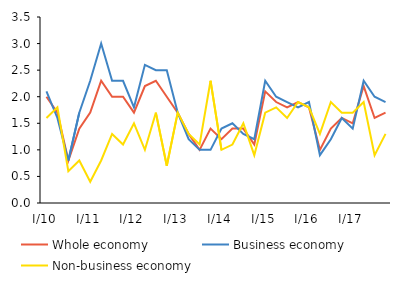
| Category | Whole economy | Business economy | Non-business economy |
|---|---|---|---|
| I/10 | 2 | 2.1 | 1.6 |
| II | 1.7 | 1.6 | 1.8 |
| III | 0.8 | 0.8 | 0.6 |
| IV | 1.4 | 1.7 | 0.8 |
| I/11 | 1.7 | 2.3 | 0.4 |
| II | 2.3 | 3 | 0.8 |
| III | 2 | 2.3 | 1.3 |
| IV | 2 | 2.3 | 1.1 |
| I/12 | 1.7 | 1.8 | 1.5 |
| II | 2.2 | 2.6 | 1 |
| III | 2.3 | 2.5 | 1.7 |
| IV | 2 | 2.5 | 0.7 |
| I/13 | 1.7 | 1.7 | 1.7 |
| II | 1.3 | 1.2 | 1.3 |
| III | 1 | 1 | 1.1 |
| IV | 1.4 | 1 | 2.3 |
| I/14 | 1.2 | 1.4 | 1 |
| II | 1.4 | 1.5 | 1.1 |
| III | 1.4 | 1.3 | 1.5 |
| IV | 1.1 | 1.2 | 0.9 |
| I/15 | 2.1 | 2.3 | 1.7 |
| II | 1.9 | 2 | 1.8 |
| III | 1.8 | 1.9 | 1.6 |
| IV | 1.9 | 1.8 | 1.9 |
| I/16 | 1.8 | 1.9 | 1.8 |
| II | 1 | 0.9 | 1.3 |
| III | 1.4 | 1.2 | 1.9 |
| IV | 1.6 | 1.6 | 1.7 |
| I/17 | 1.5 | 1.4 | 1.7 |
| II | 2.2 | 2.3 | 1.9 |
| III | 1.6 | 2 | 0.9 |
| IV | 1.7 | 1.9 | 1.3 |